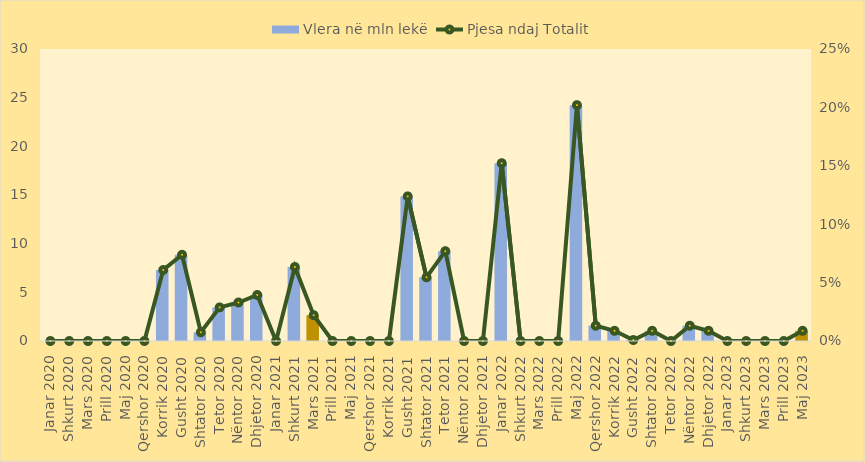
| Category | Vlera në mln lekë |
|---|---|
| Janar 2020 | 0 |
| Shkurt 2020 | 0 |
| Mars 2020 | 0 |
| Prill 2020 | 0 |
| Maj 2020 | 0 |
| Qershor 2020 | 0 |
| Korrik 2020 | 7.295 |
| Gusht 2020 | 8.855 |
| Shtator 2020 | 0.895 |
| Tetor 2020 | 3.45 |
| Nëntor 2020 | 3.955 |
| Dhjetor 2020 | 4.725 |
| Janar 2021 | 0 |
| Shkurt 2021 | 7.6 |
| Mars 2021 | 2.65 |
| Prill 2021 | 0 |
| Maj 2021 | 0 |
| Qershor 2021 | 0 |
| Korrik 2021 | 0 |
| Gusht 2021 | 14.855 |
| Shtator 2021 | 6.54 |
| Tetor 2021 | 9.224 |
| Nëntor 2021 | 0 |
| Dhjetor 2021 | 0 |
| Janar 2022 | 18.262 |
| Shkurt 2022 | 0 |
| Mars 2022 | 0 |
| Prill 2022 | 0 |
| Maj 2022 | 24.227 |
| Qershor 2022 | 1.571 |
| Korrik 2022 | 1.047 |
| Gusht 2022 | 0.1 |
| Shtator 2022 | 1.047 |
| Tetor 2022 | 0 |
| Nëntor 2022 | 1.571 |
| Dhjetor 2022 | 1.047 |
| Janar 2023 | 0 |
| Shkurt 2023 | 0 |
| Mars 2023 | 0 |
| Prill 2023 | 0 |
| Maj 2023 | 1.047 |